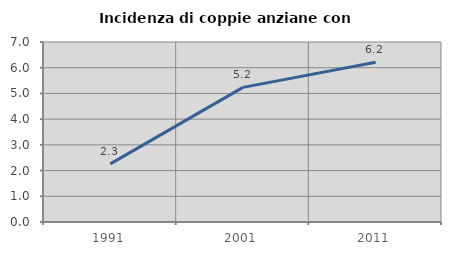
| Category | Incidenza di coppie anziane con figli |
|---|---|
| 1991.0 | 2.261 |
| 2001.0 | 5.236 |
| 2011.0 | 6.216 |